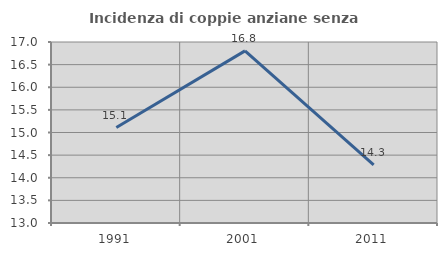
| Category | Incidenza di coppie anziane senza figli  |
|---|---|
| 1991.0 | 15.11 |
| 2001.0 | 16.804 |
| 2011.0 | 14.286 |